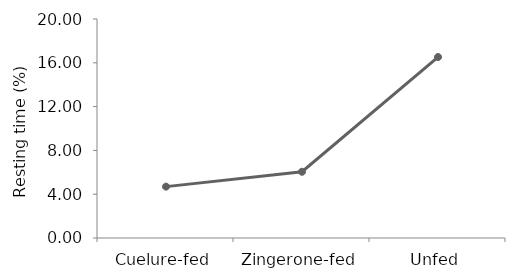
| Category | Series 0 |
|---|---|
| Cuelure-fed | 4.692 |
| Zingerone-fed | 6.05 |
| Unfed | 16.525 |